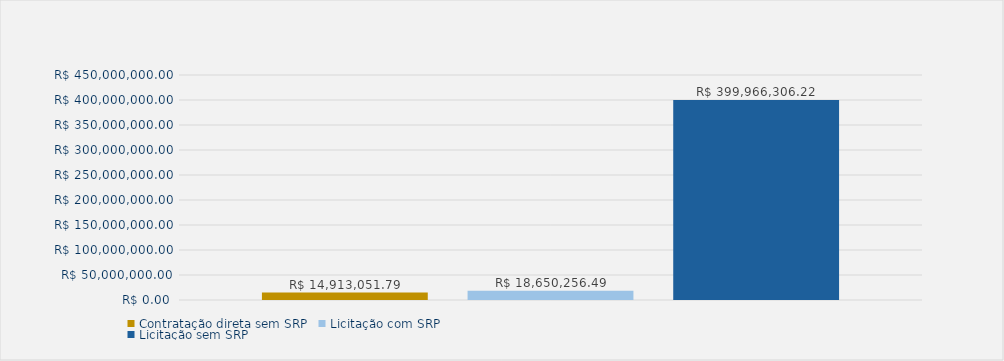
| Category | Contratação direta sem SRP | Licitação com SRP | Licitação sem SRP |
|---|---|---|---|
| Total | 14913051.79 | 18650256.49 | 399966306.22 |